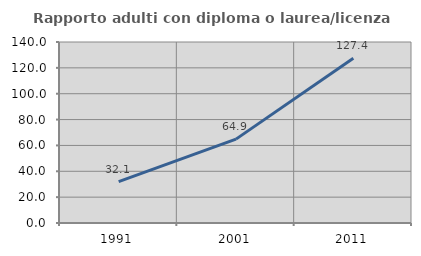
| Category | Rapporto adulti con diploma o laurea/licenza media  |
|---|---|
| 1991.0 | 32.061 |
| 2001.0 | 64.885 |
| 2011.0 | 127.358 |